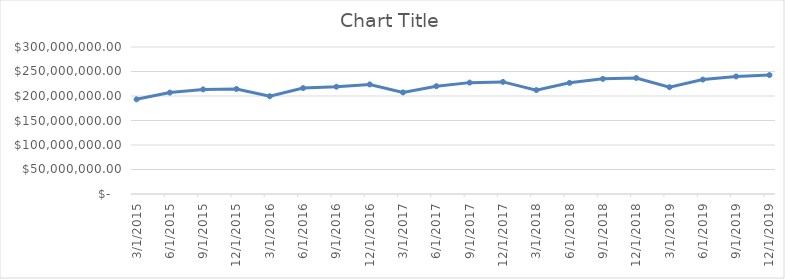
| Category | Series 0 |
|---|---|
| 3/1/15 | 193214760.65 |
| 6/1/15 | 206971890.35 |
| 9/1/15 | 213490881.83 |
| 12/1/15 | 214349105.84 |
| 3/1/16 | 199493745.37 |
| 6/1/16 | 216148419.22 |
| 9/1/16 | 218976889.8 |
| 12/1/16 | 223617895.79 |
| 3/1/17 | 207333812.45 |
| 6/1/17 | 219981727.55 |
| 9/1/17 | 227293496.76 |
| 12/1/17 | 228775828.16 |
| 3/1/18 | 212038702.39 |
| 6/1/18 | 226827967.75 |
| 9/1/18 | 235037993.57 |
| 12/1/18 | 236773515.07 |
| 3/1/19 | 217929233.04 |
| 6/1/19 | 233491945.261 |
| 9/1/19 | 239914436.961 |
| 12/1/19 | 242721412.757 |